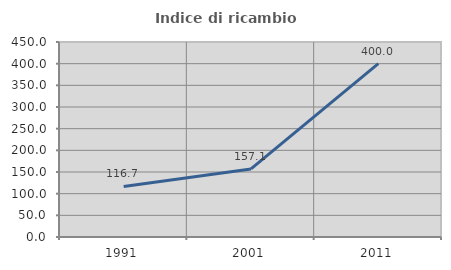
| Category | Indice di ricambio occupazionale  |
|---|---|
| 1991.0 | 116.667 |
| 2001.0 | 157.143 |
| 2011.0 | 400 |